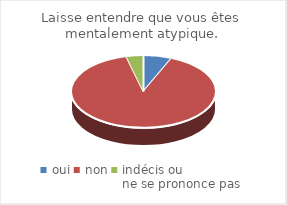
| Category | Laisse entendre que vous êtes mentalement atypique. |
|---|---|
| oui | 5 |
| non | 70 |
| indécis ou 
ne se prononce pas | 3 |